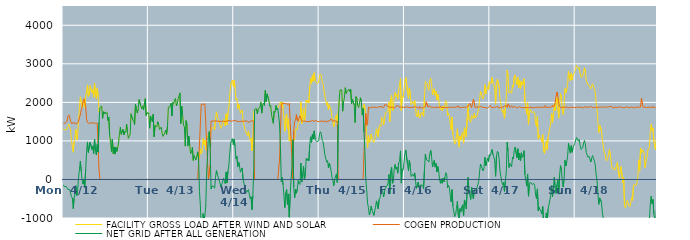
| Category | FACILITY GROSS LOAD AFTER WIND AND SOLAR | COGEN PRODUCTION | NET GRID AFTER ALL GENERATION |
|---|---|---|---|
|  Mon  4/12 | 1322 | 1463 | -141 |
|  Mon  4/12 | 1291 | 1478 | -187 |
|  Mon  4/12 | 1268 | 1458 | -190 |
|  Mon  4/12 | 1280 | 1460 | -180 |
|  Mon  4/12 | 1328 | 1510 | -182 |
|  Mon  4/12 | 1368 | 1627 | -259 |
|  Mon  4/12 | 1436 | 1673 | -237 |
|  Mon  4/12 | 1357 | 1618 | -261 |
|  Mon  4/12 | 1285 | 1523 | -238 |
|  Mon  4/12 | 1004 | 1453 | -449 |
|  Mon  4/12 | 982 | 1463 | -481 |
|  Mon  4/12 | 709 | 1468 | -759 |
|  Mon  4/12 | 981 | 1461 | -480 |
|  Mon  4/12 | 1101 | 1457 | -356 |
|  Mon  4/12 | 1300 | 1461 | -161 |
|  Mon  4/12 | 1026 | 1445 | -419 |
|  Mon  4/12 | 1167 | 1450 | -283 |
|  Mon  4/12 | 1563 | 1510 | 53 |
|  Mon  4/12 | 1871 | 1612 | 259 |
|  Mon  4/12 | 2144 | 1672 | 472 |
|  Mon  4/12 | 2006 | 1792 | 214 |
|  Mon  4/12 | 1852 | 1864 | -12 |
|  Mon  4/12 | 1910 | 2033 | -123 |
|  Mon  4/12 | 2090 | 2093 | -3 |
|  Mon  4/12 | 1867 | 2075 | -208 |
|  Mon  4/12 | 2164 | 1906 | 258 |
|  Mon  4/12 | 2269 | 1564 | 705 |
|  Mon  4/12 | 2455 | 1482 | 973 |
|  Mon  4/12 | 2152 | 1454 | 698 |
|  Mon  4/12 | 2178 | 1455 | 723 |
|  Mon  4/12 | 2434 | 1470 | 964 |
|  Mon  4/12 | 2458 | 1477 | 981 |
|  Mon  4/12 | 2248 | 1466 | 782 |
|  Mon  4/12 | 2326 | 1457 | 869 |
|  Mon  4/12 | 2133 | 1463 | 670 |
|  Mon  4/12 | 2502 | 1454 | 1048 |
|  Mon  4/12 | 2217 | 1457 | 760 |
|  Mon  4/12 | 2096 | 1461 | 635 |
|  Mon  4/12 | 2364 | 1458 | 906 |
|  Mon  4/12 | 2173 | 1464 | 709 |
|  Mon  4/12 | 1756 | 272 | 1484 |
|  Mon  4/12 | 1866 | 0 | 1866 |
|  Mon  4/12 | 1881 | 0 | 1881 |
|  Mon  4/12 | 1904 | 0 | 1904 |
|  Mon  4/12 | 1580 | 0 | 1580 |
|  Mon  4/12 | 1757 | 0 | 1757 |
|  Mon  4/12 | 1697 | 0 | 1697 |
|  Mon  4/12 | 1754 | 0 | 1754 |
|  Mon  4/12 | 1704 | 0 | 1704 |
|  Mon  4/12 | 1736 | 0 | 1736 |
|  Mon  4/12 | 1528 | 0 | 1528 |
|  Mon  4/12 | 1617 | 0 | 1617 |
|  Mon  4/12 | 1142 | 0 | 1142 |
|  Mon  4/12 | 965 | 0 | 965 |
|  Mon  4/12 | 726 | 0 | 726 |
|  Mon  4/12 | 1043 | 0 | 1043 |
|  Mon  4/12 | 674 | 0 | 674 |
|  Mon  4/12 | 843 | 0 | 843 |
|  Mon  4/12 | 657 | 0 | 657 |
|  Mon  4/12 | 835 | 0 | 835 |
|  Mon  4/12 | 726 | 0 | 726 |
|  Mon  4/12 | 821 | 0 | 821 |
|  Mon  4/12 | 948 | 0 | 948 |
|  Mon  4/12 | 1189 | 0 | 1189 |
|  Mon  4/12 | 1354 | 0 | 1354 |
|  Mon  4/12 | 1170 | 0 | 1170 |
|  Mon  4/12 | 1158 | 0 | 1158 |
|  Mon  4/12 | 1296 | 0 | 1296 |
|  Mon  4/12 | 1158 | 0 | 1158 |
|  Mon  4/12 | 1244 | 0 | 1244 |
|  Mon  4/12 | 1217 | 0 | 1217 |
|  Mon  4/12 | 1437 | 0 | 1437 |
|  Mon  4/12 | 1226 | 0 | 1226 |
|  Mon  4/12 | 1067 | 0 | 1067 |
|  Mon  4/12 | 1090 | 0 | 1090 |
|  Mon  4/12 | 1165 | 0 | 1165 |
|  Mon  4/12 | 1704 | 0 | 1704 |
|  Mon  4/12 | 1722 | 0 | 1722 |
|  Mon  4/12 | 1549 | 0 | 1549 |
|  Mon  4/12 | 1510 | 0 | 1510 |
|  Mon  4/12 | 1419 | 0 | 1419 |
|  Mon  4/12 | 1949 | 0 | 1949 |
|  Mon  4/12 | 1838 | 0 | 1838 |
|  Mon  4/12 | 1722 | 0 | 1722 |
|  Mon  4/12 | 1815 | 0 | 1815 |
|  Mon  4/12 | 2074 | 0 | 2074 |
|  Mon  4/12 | 2075 | 0 | 2075 |
|  Mon  4/12 | 1912 | 0 | 1912 |
|  Mon  4/12 | 1828 | 0 | 1828 |
|  Mon  4/12 | 1901 | 0 | 1901 |
|  Mon  4/12 | 1804 | 0 | 1804 |
|  Mon  4/12 | 1948 | 0 | 1948 |
|  Mon  4/12 | 2098 | 0 | 2098 |
|  Mon  4/12 | 1660 | 0 | 1660 |
|  Mon  4/12 | 1725 | 0 | 1725 |
|  Mon  4/12 | 1733 | 0 | 1733 |
|  Tue  4/13 | 1726 | 0 | 1726 |
|  Tue  4/13 | 1328 | 0 | 1328 |
|  Tue  4/13 | 1646 | 0 | 1646 |
|  Tue  4/13 | 1548 | 0 | 1548 |
|  Tue  4/13 | 1494 | 0 | 1494 |
|  Tue  4/13 | 1696 | 0 | 1696 |
|  Tue  4/13 | 1106 | 0 | 1106 |
|  Tue  4/13 | 1398 | 0 | 1398 |
|  Tue  4/13 | 1391 | 0 | 1391 |
|  Tue  4/13 | 1366 | 0 | 1366 |
|  Tue  4/13 | 1499 | 0 | 1499 |
|  Tue  4/13 | 1434 | 0 | 1434 |
|  Tue  4/13 | 1294 | 0 | 1294 |
|  Tue  4/13 | 1271 | 0 | 1271 |
|  Tue  4/13 | 1359 | 0 | 1359 |
|  Tue  4/13 | 1194 | 0 | 1194 |
|  Tue  4/13 | 1116 | 0 | 1116 |
|  Tue  4/13 | 1167 | 0 | 1167 |
|  Tue  4/13 | 1212 | 0 | 1212 |
|  Tue  4/13 | 1282 | 0 | 1282 |
|  Tue  4/13 | 1169 | 0 | 1169 |
|  Tue  4/13 | 1377 | 0 | 1377 |
|  Tue  4/13 | 1877 | 0 | 1877 |
|  Tue  4/13 | 1888 | 0 | 1888 |
|  Tue  4/13 | 1891 | 0 | 1891 |
|  Tue  4/13 | 1978 | 0 | 1978 |
|  Tue  4/13 | 1650 | 0 | 1650 |
|  Tue  4/13 | 1995 | 0 | 1995 |
|  Tue  4/13 | 1969 | 0 | 1969 |
|  Tue  4/13 | 2064 | 0 | 2064 |
|  Tue  4/13 | 2105 | 0 | 2105 |
|  Tue  4/13 | 1906 | 0 | 1906 |
|  Tue  4/13 | 1966 | 0 | 1966 |
|  Tue  4/13 | 2093 | 0 | 2093 |
|  Tue  4/13 | 2079 | 0 | 2079 |
|  Tue  4/13 | 2245 | 0 | 2245 |
|  Tue  4/13 | 1451 | 0 | 1451 |
|  Tue  4/13 | 1896 | 0 | 1896 |
|  Tue  4/13 | 1665 | 0 | 1665 |
|  Tue  4/13 | 1410 | 0 | 1410 |
|  Tue  4/13 | 1368 | 0 | 1368 |
|  Tue  4/13 | 864 | 0 | 864 |
|  Tue  4/13 | 1527 | 0 | 1527 |
|  Tue  4/13 | 1411 | 0 | 1411 |
|  Tue  4/13 | 867 | 0 | 867 |
|  Tue  4/13 | 1121 | 0 | 1121 |
|  Tue  4/13 | 883 | 0 | 883 |
|  Tue  4/13 | 666 | 0 | 666 |
|  Tue  4/13 | 701 | 0 | 701 |
|  Tue  4/13 | 836 | 0 | 836 |
|  Tue  4/13 | 493 | 0 | 493 |
|  Tue  4/13 | 619 | 0 | 619 |
|  Tue  4/13 | 564 | 0 | 564 |
|  Tue  4/13 | 503 | 0 | 503 |
|  Tue  4/13 | 496 | 0 | 496 |
|  Tue  4/13 | 716 | 0 | 716 |
|  Tue  4/13 | 527 | 0 | 527 |
|  Tue  4/13 | 584 | 897 | -313 |
|  Tue  4/13 | 800 | 1480 | -680 |
|  Tue  4/13 | 662 | 1952 | -1290 |
|  Tue  4/13 | 718 | 1960 | -1242 |
|  Tue  4/13 | 1066 | 1951 | -885 |
|  Tue  4/13 | 899 | 1959 | -1060 |
|  Tue  4/13 | 1024 | 1958 | -934 |
|  Tue  4/13 | 778 | 1494 | -716 |
|  Tue  4/13 | 1148 | 991 | 157 |
|  Tue  4/13 | 1091 | 497 | 594 |
|  Tue  4/13 | 1139 | 0 | 1139 |
|  Tue  4/13 | 1244 | 0 | 1244 |
|  Tue  4/13 | 1198 | 363 | 835 |
|  Tue  4/13 | 1264 | 1514 | -250 |
|  Tue  4/13 | 1347 | 1515 | -168 |
|  Tue  4/13 | 1364 | 1518 | -154 |
|  Tue  4/13 | 1339 | 1522 | -183 |
|  Tue  4/13 | 1289 | 1516 | -227 |
|  Tue  4/13 | 1567 | 1519 | 48 |
|  Tue  4/13 | 1753 | 1523 | 230 |
|  Tue  4/13 | 1648 | 1511 | 137 |
|  Tue  4/13 | 1573 | 1506 | 67 |
|  Tue  4/13 | 1572 | 1511 | 61 |
|  Tue  4/13 | 1423 | 1511 | -88 |
|  Tue  4/13 | 1322 | 1517 | -195 |
|  Tue  4/13 | 1380 | 1502 | -122 |
|  Tue  4/13 | 1446 | 1515 | -69 |
|  Tue  4/13 | 1554 | 1517 | 37 |
|  Tue  4/13 | 1479 | 1510 | -31 |
|  Tue  4/13 | 1390 | 1501 | -111 |
|  Tue  4/13 | 1701 | 1507 | 194 |
|  Tue  4/13 | 1423 | 1512 | -89 |
|  Tue  4/13 | 1729 | 1507 | 222 |
|  Tue  4/13 | 1876 | 1529 | 347 |
|  Tue  4/13 | 2178 | 1504 | 674 |
|  Tue  4/13 | 2445 | 1513 | 932 |
|  Tue  4/13 | 2523 | 1507 | 1016 |
|  Tue  4/13 | 2574 | 1515 | 1059 |
|  Tue  4/13 | 2415 | 1512 | 903 |
|  Wed  4/14 | 2573 | 1527 | 1046 |
|  Wed  4/14 | 2372 | 1522 | 850 |
|  Wed  4/14 | 2067 | 1526 | 541 |
|  Wed  4/14 | 2109 | 1506 | 603 |
|  Wed  4/14 | 1833 | 1498 | 335 |
|  Wed  4/14 | 1958 | 1508 | 450 |
|  Wed  4/14 | 1854 | 1504 | 350 |
|  Wed  4/14 | 1715 | 1527 | 188 |
|  Wed  4/14 | 1696 | 1510 | 186 |
|  Wed  4/14 | 1802 | 1504 | 298 |
|  Wed  4/14 | 1514 | 1508 | 6 |
|  Wed  4/14 | 1514 | 1526 | -12 |
|  Wed  4/14 | 1308 | 1516 | -208 |
|  Wed  4/14 | 1326 | 1515 | -189 |
|  Wed  4/14 | 1185 | 1522 | -337 |
|  Wed  4/14 | 1139 | 1492 | -353 |
|  Wed  4/14 | 1250 | 1515 | -265 |
|  Wed  4/14 | 1110 | 1485 | -375 |
|  Wed  4/14 | 1018 | 1514 | -496 |
|  Wed  4/14 | 1066 | 1513 | -447 |
|  Wed  4/14 | 738 | 1520 | -782 |
|  Wed  4/14 | 1102 | 1527 | -425 |
|  Wed  4/14 | 1748 | 1508 | 240 |
|  Wed  4/14 | 1823 | 0 | 1823 |
|  Wed  4/14 | 1808 | 0 | 1808 |
|  Wed  4/14 | 1839 | 0 | 1839 |
|  Wed  4/14 | 1701 | 0 | 1701 |
|  Wed  4/14 | 1824 | 0 | 1824 |
|  Wed  4/14 | 1832 | 0 | 1832 |
|  Wed  4/14 | 1879 | 0 | 1879 |
|  Wed  4/14 | 1999 | 0 | 1999 |
|  Wed  4/14 | 1721 | 0 | 1721 |
|  Wed  4/14 | 1933 | 0 | 1933 |
|  Wed  4/14 | 1985 | 0 | 1985 |
|  Wed  4/14 | 1918 | 0 | 1918 |
|  Wed  4/14 | 2310 | 0 | 2310 |
|  Wed  4/14 | 2014 | 0 | 2014 |
|  Wed  4/14 | 2222 | 0 | 2222 |
|  Wed  4/14 | 2237 | 0 | 2237 |
|  Wed  4/14 | 2050 | 0 | 2050 |
|  Wed  4/14 | 1898 | 0 | 1898 |
|  Wed  4/14 | 1927 | 0 | 1927 |
|  Wed  4/14 | 1678 | 0 | 1678 |
|  Wed  4/14 | 1660 | 0 | 1660 |
|  Wed  4/14 | 1456 | 0 | 1456 |
|  Wed  4/14 | 1771 | 0 | 1771 |
|  Wed  4/14 | 1742 | 0 | 1742 |
|  Wed  4/14 | 1917 | 0 | 1917 |
|  Wed  4/14 | 1801 | 0 | 1801 |
|  Wed  4/14 | 1852 | 0 | 1852 |
|  Wed  4/14 | 1830 | 0 | 1830 |
|  Wed  4/14 | 1943 | 505 | 1438 |
|  Wed  4/14 | 2008 | 1164 | 844 |
|  Wed  4/14 | 1896 | 1956 | -60 |
|  Wed  4/14 | 2014 | 1961 | 53 |
|  Wed  4/14 | 1837 | 1975 | -138 |
|  Wed  4/14 | 1847 | 1967 | -120 |
|  Wed  4/14 | 1243 | 1972 | -729 |
|  Wed  4/14 | 1609 | 1959 | -350 |
|  Wed  4/14 | 1700 | 1960 | -260 |
|  Wed  4/14 | 1312 | 1962 | -650 |
|  Wed  4/14 | 1572 | 1947 | -375 |
|  Wed  4/14 | 996 | 1976 | -980 |
|  Wed  4/14 | 1111 | 1483 | -372 |
|  Wed  4/14 | 995 | 988 | 7 |
|  Wed  4/14 | 838 | 506 | 332 |
|  Wed  4/14 | 1031 | 0 | 1031 |
|  Wed  4/14 | 1060 | 1255 | -195 |
|  Wed  4/14 | 1025 | 1505 | -480 |
|  Wed  4/14 | 1288 | 1540 | -252 |
|  Wed  4/14 | 1325 | 1682 | -357 |
|  Wed  4/14 | 1291 | 1535 | -244 |
|  Wed  4/14 | 1479 | 1508 | -29 |
|  Wed  4/14 | 1503 | 1606 | -103 |
|  Wed  4/14 | 1518 | 1649 | -131 |
|  Wed  4/14 | 2012 | 1587 | 425 |
|  Wed  4/14 | 1444 | 1512 | -68 |
|  Wed  4/14 | 1668 | 1515 | 153 |
|  Wed  4/14 | 1854 | 1510 | 344 |
|  Wed  4/14 | 1510 | 1509 | 1 |
|  Wed  4/14 | 1646 | 1512 | 134 |
|  Wed  4/14 | 2059 | 1518 | 541 |
|  Wed  4/14 | 1997 | 1502 | 495 |
|  Wed  4/14 | 2055 | 1512 | 543 |
|  Wed  4/14 | 1985 | 1503 | 482 |
|  Wed  4/14 | 2415 | 1508 | 907 |
|  Wed  4/14 | 2617 | 1510 | 1107 |
|  Wed  4/14 | 2484 | 1523 | 961 |
|  Wed  4/14 | 2693 | 1524 | 1169 |
|  Wed  4/14 | 2551 | 1502 | 1049 |
|  Wed  4/14 | 2768 | 1508 | 1260 |
|  Wed  4/14 | 2562 | 1517 | 1045 |
|  Wed  4/14 | 2535 | 1531 | 1004 |
|  Wed  4/14 | 2490 | 1513 | 977 |
|  Wed  4/14 | 2493 | 1502 | 991 |
|  Wed  4/14 | 2514 | 1510 | 1004 |
|  Thu  4/15 | 2682 | 1500 | 1182 |
|  Thu  4/15 | 2738 | 1500 | 1238 |
|  Thu  4/15 | 2694 | 1518 | 1176 |
|  Thu  4/15 | 2524 | 1513 | 1011 |
|  Thu  4/15 | 2479 | 1503 | 976 |
|  Thu  4/15 | 2476 | 1508 | 968 |
|  Thu  4/15 | 2164 | 1520 | 644 |
|  Thu  4/15 | 2162 | 1518 | 644 |
|  Thu  4/15 | 1930 | 1481 | 449 |
|  Thu  4/15 | 2008 | 1521 | 487 |
|  Thu  4/15 | 1813 | 1516 | 297 |
|  Thu  4/15 | 1935 | 1511 | 424 |
|  Thu  4/15 | 1875 | 1546 | 329 |
|  Thu  4/15 | 1799 | 1572 | 227 |
|  Thu  4/15 | 1600 | 1546 | 54 |
|  Thu  4/15 | 1479 | 1502 | -23 |
|  Thu  4/15 | 1367 | 1529 | -162 |
|  Thu  4/15 | 1535 | 1521 | 14 |
|  Thu  4/15 | 1524 | 1511 | 13 |
|  Thu  4/15 | 1676 | 1532 | 144 |
|  Thu  4/15 | 1429 | 1505 | -76 |
|  Thu  4/15 | 1411 | 0 | 1411 |
|  Thu  4/15 | 2031 | 0 | 2031 |
|  Thu  4/15 | 2324 | 0 | 2324 |
|  Thu  4/15 | 2341 | 0 | 2341 |
|  Thu  4/15 | 2321 | 0 | 2321 |
|  Thu  4/15 | 1771 | 0 | 1771 |
|  Thu  4/15 | 2005 | 0 | 2005 |
|  Thu  4/15 | 2130 | 0 | 2130 |
|  Thu  4/15 | 2381 | 0 | 2381 |
|  Thu  4/15 | 2230 | 0 | 2230 |
|  Thu  4/15 | 2278 | 0 | 2278 |
|  Thu  4/15 | 2274 | 0 | 2274 |
|  Thu  4/15 | 2342 | 0 | 2342 |
|  Thu  4/15 | 2275 | 0 | 2275 |
|  Thu  4/15 | 2346 | 0 | 2346 |
|  Thu  4/15 | 1966 | 0 | 1966 |
|  Thu  4/15 | 2075 | 0 | 2075 |
|  Thu  4/15 | 2096 | 0 | 2096 |
|  Thu  4/15 | 1933 | 0 | 1933 |
|  Thu  4/15 | 1475 | 0 | 1475 |
|  Thu  4/15 | 2149 | 0 | 2149 |
|  Thu  4/15 | 2110 | 0 | 2110 |
|  Thu  4/15 | 1907 | 0 | 1907 |
|  Thu  4/15 | 1867 | 0 | 1867 |
|  Thu  4/15 | 1986 | 0 | 1986 |
|  Thu  4/15 | 2120 | 0 | 2120 |
|  Thu  4/15 | 2019 | 0 | 2019 |
|  Thu  4/15 | 1671 | 0 | 1671 |
|  Thu  4/15 | 1841 | 0 | 1841 |
|  Thu  4/15 | 1947 | 725 | 1222 |
|  Thu  4/15 | 1929 | 1202 | 727 |
|  Thu  4/15 | 1739 | 1713 | 26 |
|  Thu  4/15 | 1136 | 1407 | -271 |
|  Thu  4/15 | 822 | 1442 | -620 |
|  Thu  4/15 | 1149 | 1878 | -729 |
|  Thu  4/15 | 962 | 1879 | -917 |
|  Thu  4/15 | 1004 | 1843 | -839 |
|  Thu  4/15 | 1181 | 1870 | -689 |
|  Thu  4/15 | 1064 | 1860 | -796 |
|  Thu  4/15 | 1023 | 1879 | -856 |
|  Thu  4/15 | 951 | 1881 | -930 |
|  Thu  4/15 | 1054 | 1870 | -816 |
|  Thu  4/15 | 1149 | 1872 | -723 |
|  Thu  4/15 | 1313 | 1868 | -555 |
|  Thu  4/15 | 1316 | 1862 | -546 |
|  Thu  4/15 | 1108 | 1871 | -763 |
|  Thu  4/15 | 1350 | 1872 | -522 |
|  Thu  4/15 | 1415 | 1892 | -477 |
|  Thu  4/15 | 1377 | 1871 | -494 |
|  Thu  4/15 | 1613 | 1880 | -267 |
|  Thu  4/15 | 1587 | 1886 | -299 |
|  Thu  4/15 | 1419 | 1869 | -450 |
|  Thu  4/15 | 1549 | 1879 | -330 |
|  Thu  4/15 | 1731 | 1956 | -225 |
|  Thu  4/15 | 1729 | 1942 | -213 |
|  Thu  4/15 | 1751 | 1907 | -156 |
|  Thu  4/15 | 1786 | 1885 | -99 |
|  Thu  4/15 | 2015 | 1886 | 129 |
|  Thu  4/15 | 1498 | 1876 | -378 |
|  Thu  4/15 | 2082 | 1868 | 214 |
|  Thu  4/15 | 2186 | 1862 | 324 |
|  Thu  4/15 | 1775 | 1874 | -99 |
|  Thu  4/15 | 1834 | 1878 | -44 |
|  Thu  4/15 | 2132 | 1852 | 280 |
|  Thu  4/15 | 2258 | 1869 | 389 |
|  Thu  4/15 | 2156 | 1892 | 264 |
|  Thu  4/15 | 2198 | 1878 | 320 |
|  Thu  4/15 | 2082 | 1919 | 163 |
|  Thu  4/15 | 2320 | 1885 | 435 |
|  Thu  4/15 | 2341 | 1870 | 471 |
|  Thu  4/15 | 2615 | 1874 | 741 |
|  Thu  4/15 | 1780 | 1875 | -95 |
|  Thu  4/15 | 2154 | 1879 | 275 |
|  Thu  4/15 | 2113 | 1871 | 242 |
|  Thu  4/15 | 2091 | 1869 | 222 |
|  Fri  4/16 | 2548 | 1875 | 673 |
|  Fri  4/16 | 2645 | 1879 | 766 |
|  Fri  4/16 | 2635 | 1882 | 753 |
|  Fri  4/16 | 2272 | 1880 | 392 |
|  Fri  4/16 | 2102 | 1880 | 222 |
|  Fri  4/16 | 2367 | 1868 | 499 |
|  Fri  4/16 | 2228 | 1873 | 355 |
|  Fri  4/16 | 1941 | 1865 | 76 |
|  Fri  4/16 | 1927 | 1871 | 56 |
|  Fri  4/16 | 2016 | 1880 | 136 |
|  Fri  4/16 | 1950 | 1870 | 80 |
|  Fri  4/16 | 2052 | 1881 | 171 |
|  Fri  4/16 | 1805 | 1856 | -51 |
|  Fri  4/16 | 1648 | 1878 | -230 |
|  Fri  4/16 | 1622 | 1875 | -253 |
|  Fri  4/16 | 1795 | 1863 | -68 |
|  Fri  4/16 | 1625 | 1836 | -211 |
|  Fri  4/16 | 1592 | 1890 | -298 |
|  Fri  4/16 | 1723 | 1862 | -139 |
|  Fri  4/16 | 1751 | 1881 | -130 |
|  Fri  4/16 | 1695 | 1851 | -156 |
|  Fri  4/16 | 1637 | 1878 | -241 |
|  Fri  4/16 | 2136 | 1879 | 257 |
|  Fri  4/16 | 2544 | 1884 | 660 |
|  Fri  4/16 | 2531 | 2014 | 517 |
|  Fri  4/16 | 2494 | 1995 | 499 |
|  Fri  4/16 | 2359 | 1876 | 483 |
|  Fri  4/16 | 2314 | 1863 | 451 |
|  Fri  4/16 | 2575 | 1907 | 668 |
|  Fri  4/16 | 2628 | 1872 | 756 |
|  Fri  4/16 | 2473 | 1873 | 600 |
|  Fri  4/16 | 2198 | 1876 | 322 |
|  Fri  4/16 | 2295 | 1863 | 432 |
|  Fri  4/16 | 2356 | 1861 | 495 |
|  Fri  4/16 | 2186 | 1866 | 320 |
|  Fri  4/16 | 2286 | 1874 | 412 |
|  Fri  4/16 | 2064 | 1867 | 197 |
|  Fri  4/16 | 2207 | 1872 | 335 |
|  Fri  4/16 | 2084 | 1879 | 205 |
|  Fri  4/16 | 1870 | 1868 | 2 |
|  Fri  4/16 | 1808 | 1907 | -99 |
|  Fri  4/16 | 1877 | 1860 | 17 |
|  Fri  4/16 | 1783 | 1881 | -98 |
|  Fri  4/16 | 1905 | 1870 | 35 |
|  Fri  4/16 | 1836 | 1895 | -59 |
|  Fri  4/16 | 1925 | 1870 | 55 |
|  Fri  4/16 | 2046 | 1870 | 176 |
|  Fri  4/16 | 1997 | 1864 | 133 |
|  Fri  4/16 | 1658 | 1870 | -212 |
|  Fri  4/16 | 1711 | 1868 | -157 |
|  Fri  4/16 | 1655 | 1864 | -209 |
|  Fri  4/16 | 1454 | 1873 | -419 |
|  Fri  4/16 | 1292 | 1872 | -580 |
|  Fri  4/16 | 1618 | 1882 | -264 |
|  Fri  4/16 | 1162 | 1863 | -701 |
|  Fri  4/16 | 1156 | 1866 | -710 |
|  Fri  4/16 | 915 | 1881 | -966 |
|  Fri  4/16 | 963 | 1877 | -914 |
|  Fri  4/16 | 1134 | 1882 | -748 |
|  Fri  4/16 | 1315 | 1883 | -568 |
|  Fri  4/16 | 997 | 1913 | -916 |
|  Fri  4/16 | 839 | 1861 | -1022 |
|  Fri  4/16 | 1123 | 1880 | -757 |
|  Fri  4/16 | 1027 | 1859 | -832 |
|  Fri  4/16 | 1169 | 1878 | -709 |
|  Fri  4/16 | 1217 | 1873 | -656 |
|  Fri  4/16 | 941 | 1874 | -933 |
|  Fri  4/16 | 1342 | 1873 | -531 |
|  Fri  4/16 | 1250 | 1859 | -609 |
|  Fri  4/16 | 1109 | 1876 | -767 |
|  Fri  4/16 | 1591 | 1866 | -275 |
|  Fri  4/16 | 1948 | 1893 | 55 |
|  Fri  4/16 | 1551 | 1869 | -318 |
|  Fri  4/16 | 1565 | 1978 | -413 |
|  Fri  4/16 | 1483 | 2003 | -520 |
|  Fri  4/16 | 1661 | 1864 | -203 |
|  Fri  4/16 | 1643 | 1855 | -212 |
|  Fri  4/16 | 1577 | 2081 | -504 |
|  Fri  4/16 | 1716 | 1986 | -270 |
|  Fri  4/16 | 1595 | 1863 | -268 |
|  Fri  4/16 | 1588 | 1863 | -275 |
|  Fri  4/16 | 1649 | 1878 | -229 |
|  Fri  4/16 | 1750 | 1886 | -136 |
|  Fri  4/16 | 1833 | 1879 | -46 |
|  Fri  4/16 | 2069 | 1870 | 199 |
|  Fri  4/16 | 2293 | 1895 | 398 |
|  Fri  4/16 | 2216 | 1873 | 343 |
|  Fri  4/16 | 2149 | 1877 | 272 |
|  Fri  4/16 | 2084 | 1862 | 222 |
|  Fri  4/16 | 2182 | 1864 | 318 |
|  Fri  4/16 | 2461 | 1885 | 576 |
|  Fri  4/16 | 2220 | 1865 | 355 |
|  Fri  4/16 | 2326 | 1867 | 459 |
|  Fri  4/16 | 2403 | 1849 | 554 |
|  Fri  4/16 | 2328 | 1865 | 463 |
|  Fri  4/16 | 2537 | 1894 | 643 |
|  Sat  4/17 | 2538 | 1923 | 615 |
|  Sat  4/17 | 2490 | 1863 | 627 |
|  Sat  4/17 | 2657 | 1881 | 776 |
|  Sat  4/17 | 2507 | 1861 | 646 |
|  Sat  4/17 | 2460 | 1875 | 585 |
|  Sat  4/17 | 2369 | 1871 | 498 |
|  Sat  4/17 | 1953 | 1871 | 82 |
|  Sat  4/17 | 2496 | 1888 | 608 |
|  Sat  4/17 | 2600 | 1870 | 730 |
|  Sat  4/17 | 2591 | 1887 | 704 |
|  Sat  4/17 | 2374 | 1850 | 524 |
|  Sat  4/17 | 2061 | 1861 | 200 |
|  Sat  4/17 | 1943 | 1869 | 74 |
|  Sat  4/17 | 1789 | 1864 | -75 |
|  Sat  4/17 | 1733 | 1874 | -141 |
|  Sat  4/17 | 1817 | 1889 | -72 |
|  Sat  4/17 | 1586 | 1895 | -309 |
|  Sat  4/17 | 1845 | 1878 | -33 |
|  Sat  4/17 | 2114 | 1925 | 189 |
|  Sat  4/17 | 2835 | 1866 | 969 |
|  Sat  4/17 | 2686 | 1963 | 723 |
|  Sat  4/17 | 2243 | 1933 | 310 |
|  Sat  4/17 | 2279 | 1867 | 412 |
|  Sat  4/17 | 2266 | 1870 | 396 |
|  Sat  4/17 | 2237 | 1911 | 326 |
|  Sat  4/17 | 2445 | 1869 | 576 |
|  Sat  4/17 | 2394 | 1854 | 540 |
|  Sat  4/17 | 2658 | 1891 | 767 |
|  Sat  4/17 | 2716 | 1875 | 841 |
|  Sat  4/17 | 2712 | 1870 | 842 |
|  Sat  4/17 | 2451 | 1886 | 565 |
|  Sat  4/17 | 2652 | 1855 | 797 |
|  Sat  4/17 | 2380 | 1869 | 511 |
|  Sat  4/17 | 2573 | 1890 | 683 |
|  Sat  4/17 | 2356 | 1877 | 479 |
|  Sat  4/17 | 2554 | 1863 | 691 |
|  Sat  4/17 | 2450 | 1876 | 574 |
|  Sat  4/17 | 2465 | 1862 | 603 |
|  Sat  4/17 | 2613 | 1866 | 747 |
|  Sat  4/17 | 1992 | 1867 | 125 |
|  Sat  4/17 | 1844 | 1865 | -21 |
|  Sat  4/17 | 1692 | 1865 | -173 |
|  Sat  4/17 | 1999 | 1863 | 136 |
|  Sat  4/17 | 1424 | 1859 | -435 |
|  Sat  4/17 | 1732 | 1865 | -133 |
|  Sat  4/17 | 1813 | 1880 | -67 |
|  Sat  4/17 | 1825 | 1877 | -52 |
|  Sat  4/17 | 1730 | 1860 | -130 |
|  Sat  4/17 | 1717 | 1872 | -155 |
|  Sat  4/17 | 1762 | 1866 | -104 |
|  Sat  4/17 | 1730 | 1881 | -151 |
|  Sat  4/17 | 1454 | 1866 | -412 |
|  Sat  4/17 | 1370 | 1866 | -496 |
|  Sat  4/17 | 1628 | 1873 | -245 |
|  Sat  4/17 | 1053 | 1871 | -818 |
|  Sat  4/17 | 1151 | 1870 | -719 |
|  Sat  4/17 | 1088 | 1876 | -788 |
|  Sat  4/17 | 1056 | 1879 | -823 |
|  Sat  4/17 | 977 | 1870 | -893 |
|  Sat  4/17 | 1167 | 1870 | -703 |
|  Sat  4/17 | 738 | 1880 | -1142 |
|  Sat  4/17 | 676 | 1866 | -1190 |
|  Sat  4/17 | 860 | 1922 | -1062 |
|  Sat  4/17 | 1000 | 1869 | -869 |
|  Sat  4/17 | 778 | 1886 | -1108 |
|  Sat  4/17 | 1100 | 1869 | -769 |
|  Sat  4/17 | 1222 | 1887 | -665 |
|  Sat  4/17 | 1340 | 1869 | -529 |
|  Sat  4/17 | 1453 | 1875 | -422 |
|  Sat  4/17 | 1721 | 1881 | -160 |
|  Sat  4/17 | 1481 | 1928 | -447 |
|  Sat  4/17 | 1673 | 1877 | -204 |
|  Sat  4/17 | 1966 | 1909 | 57 |
|  Sat  4/17 | 1790 | 1989 | -199 |
|  Sat  4/17 | 1797 | 2161 | -364 |
|  Sat  4/17 | 2138 | 2269 | -131 |
|  Sat  4/17 | 2145 | 2159 | -14 |
|  Sat  4/17 | 1592 | 1973 | -381 |
|  Sat  4/17 | 2009 | 1889 | 120 |
|  Sat  4/17 | 2228 | 1869 | 359 |
|  Sat  4/17 | 2109 | 1855 | 254 |
|  Sat  4/17 | 1798 | 1868 | -70 |
|  Sat  4/17 | 1684 | 1880 | -196 |
|  Sat  4/17 | 1890 | 1876 | 14 |
|  Sat  4/17 | 2358 | 1860 | 498 |
|  Sat  4/17 | 2247 | 1897 | 350 |
|  Sat  4/17 | 2337 | 1886 | 451 |
|  Sat  4/17 | 2478 | 1859 | 619 |
|  Sat  4/17 | 2807 | 1872 | 935 |
|  Sat  4/17 | 2638 | 1866 | 772 |
|  Sat  4/17 | 2556 | 1873 | 683 |
|  Sat  4/17 | 2756 | 1878 | 878 |
|  Sat  4/17 | 2585 | 1880 | 705 |
|  Sat  4/17 | 2694 | 1871 | 823 |
|  Sat  4/17 | 2748 | 1868 | 880 |
|  Sat  4/17 | 2798 | 1863 | 935 |
|  Sun  4/18 | 2773 | 1854 | 919 |
|  Sun  4/18 | 2957 | 1868 | 1089 |
|  Sun  4/18 | 2928 | 1879 | 1049 |
|  Sun  4/18 | 2876 | 1882 | 994 |
|  Sun  4/18 | 2906 | 1871 | 1035 |
|  Sun  4/18 | 2757 | 1871 | 886 |
|  Sun  4/18 | 2655 | 1874 | 781 |
|  Sun  4/18 | 2655 | 1866 | 789 |
|  Sun  4/18 | 2685 | 1862 | 823 |
|  Sun  4/18 | 2803 | 1854 | 949 |
|  Sun  4/18 | 2897 | 1887 | 1010 |
|  Sun  4/18 | 2776 | 1876 | 900 |
|  Sun  4/18 | 2565 | 1871 | 694 |
|  Sun  4/18 | 2579 | 1878 | 701 |
|  Sun  4/18 | 2449 | 1874 | 575 |
|  Sun  4/18 | 2460 | 1857 | 603 |
|  Sun  4/18 | 2416 | 1881 | 535 |
|  Sun  4/18 | 2350 | 1896 | 454 |
|  Sun  4/18 | 2436 | 1890 | 546 |
|  Sun  4/18 | 2484 | 1861 | 623 |
|  Sun  4/18 | 2481 | 1872 | 609 |
|  Sun  4/18 | 2358 | 1869 | 489 |
|  Sun  4/18 | 2279 | 1885 | 394 |
|  Sun  4/18 | 2010 | 1876 | 134 |
|  Sun  4/18 | 1866 | 1877 | -11 |
|  Sun  4/18 | 1513 | 1864 | -351 |
|  Sun  4/18 | 1213 | 1861 | -648 |
|  Sun  4/18 | 1407 | 1886 | -479 |
|  Sun  4/18 | 1400 | 1878 | -478 |
|  Sun  4/18 | 1278 | 1871 | -593 |
|  Sun  4/18 | 1037 | 1882 | -845 |
|  Sun  4/18 | 1029 | 1878 | -849 |
|  Sun  4/18 | 712 | 1866 | -1154 |
|  Sun  4/18 | 666 | 1886 | -1220 |
|  Sun  4/18 | 518 | 1871 | -1353 |
|  Sun  4/18 | 483 | 1859 | -1376 |
|  Sun  4/18 | 553 | 1885 | -1332 |
|  Sun  4/18 | 636 | 1871 | -1235 |
|  Sun  4/18 | 774 | 1885 | -1111 |
|  Sun  4/18 | 652 | 1866 | -1214 |
|  Sun  4/18 | 436 | 1903 | -1467 |
|  Sun  4/18 | 288 | 1868 | -1580 |
|  Sun  4/18 | 270 | 1858 | -1588 |
|  Sun  4/18 | 292 | 1850 | -1558 |
|  Sun  4/18 | 241 | 1882 | -1641 |
|  Sun  4/18 | 311 | 1882 | -1571 |
|  Sun  4/18 | 353 | 1870 | -1517 |
|  Sun  4/18 | 454 | 1871 | -1417 |
|  Sun  4/18 | 195 | 1868 | -1673 |
|  Sun  4/18 | 49 | 1869 | -1820 |
|  Sun  4/18 | 199 | 1894 | -1695 |
|  Sun  4/18 | 336 | 1868 | -1532 |
|  Sun  4/18 | 359 | 1862 | -1503 |
|  Sun  4/18 | -80 | 1862 | -1942 |
|  Sun  4/18 | 50 | 1876 | -1826 |
|  Sun  4/18 | -675 | 1865 | -2540 |
|  Sun  4/18 | -744 | 1886 | -2630 |
|  Sun  4/18 | -728 | 1879 | -2607 |
|  Sun  4/18 | -540 | 1867 | -2407 |
|  Sun  4/18 | -546 | 1876 | -2422 |
|  Sun  4/18 | -682 | 1868 | -2550 |
|  Sun  4/18 | -710 | 1857 | -2567 |
|  Sun  4/18 | -607 | 1862 | -2469 |
|  Sun  4/18 | -467 | 1882 | -2349 |
|  Sun  4/18 | -543 | 1863 | -2406 |
|  Sun  4/18 | -172 | 1862 | -2034 |
|  Sun  4/18 | -121 | 1880 | -2001 |
|  Sun  4/18 | -96 | 1860 | -1956 |
|  Sun  4/18 | -160 | 1857 | -2017 |
|  Sun  4/18 | -80 | 1876 | -1956 |
|  Sun  4/18 | 91 | 1885 | -1794 |
|  Sun  4/18 | 503 | 1875 | -1372 |
|  Sun  4/18 | 216 | 1889 | -1673 |
|  Sun  4/18 | 816 | 1878 | -1062 |
|  Sun  4/18 | 683 | 2107 | -1424 |
|  Sun  4/18 | 772 | 1955 | -1183 |
|  Sun  4/18 | 790 | 1867 | -1077 |
|  Sun  4/18 | 691 | 1887 | -1196 |
|  Sun  4/18 | 310 | 1882 | -1572 |
|  Sun  4/18 | 450 | 1865 | -1415 |
|  Sun  4/18 | 550 | 1864 | -1314 |
|  Sun  4/18 | 741 | 1851 | -1110 |
|  Sun  4/18 | 762 | 1878 | -1116 |
|  Sun  4/18 | 837 | 1890 | -1053 |
|  Sun  4/18 | 1251 | 1865 | -614 |
|  Sun  4/18 | 1438 | 1874 | -436 |
|  Sun  4/18 | 1269 | 1897 | -628 |
|  Sun  4/18 | 1331 | 1853 | -522 |
|  Sun  4/18 | 979 | 1886 | -907 |
|  Sun  4/18 | 838 | 1889 | -1051 |
|  Sun  4/18 | 771 | 1851 | -1080 |
|  Sun  4/18 | 1138 | 1868 | -730 |